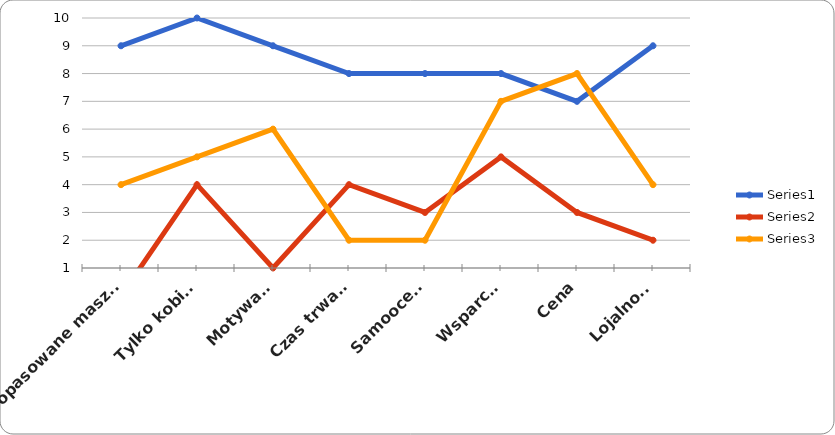
| Category | Series 0 | Series 1 | Series 2 |
|---|---|---|---|
| Dopasowane maszyny | 9 | 0 | 4 |
| Tylko kobiety | 10 | 4 | 5 |
| Motywacja | 9 | 1 | 6 |
| Czas trwania | 8 | 4 | 2 |
| Samoocena | 8 | 3 | 2 |
| Wsparcie | 8 | 5 | 7 |
| Cena | 7 | 3 | 8 |
| Lojalność | 9 | 2 | 4 |